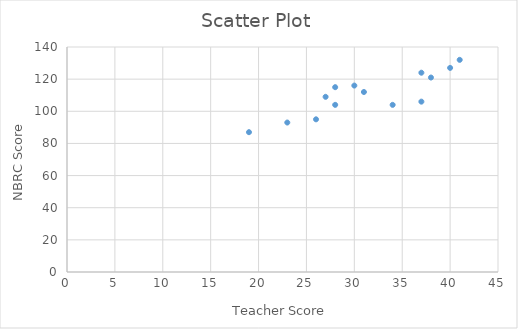
| Category | NBRC Score |
|---|---|
| 38.0 | 121 |
| 19.0 | 87 |
| 41.0 | 132 |
| 28.0 | 115 |
| 34.0 | 104 |
| 37.0 | 106 |
| 26.0 | 95 |
| 28.0 | 104 |
| 31.0 | 112 |
| 37.0 | 124 |
| 30.0 | 116 |
| 23.0 | 93 |
| 27.0 | 109 |
| 40.0 | 127 |